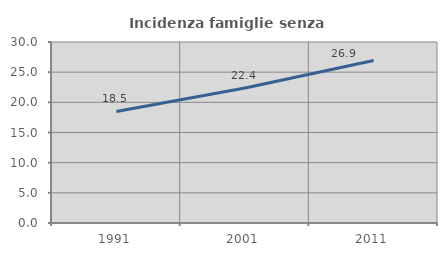
| Category | Incidenza famiglie senza nuclei |
|---|---|
| 1991.0 | 18.494 |
| 2001.0 | 22.364 |
| 2011.0 | 26.927 |